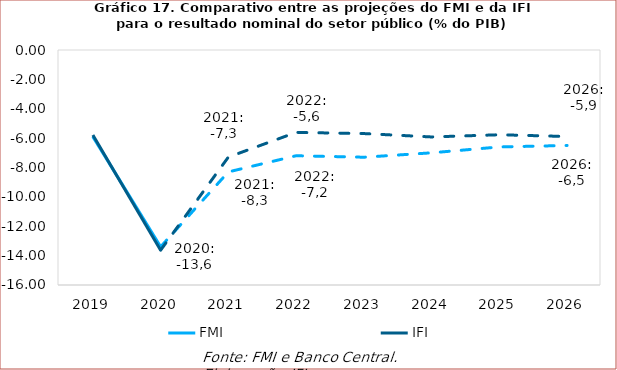
| Category | FMI | IFI |
|---|---|---|
| 2019.0 | -5.9 | -5.79 |
| 2020.0 | -13.4 | -13.63 |
| 2021.0 | -8.3 | -7.29 |
| 2022.0 | -7.2 | -5.61 |
| 2023.0 | -7.3 | -5.69 |
| 2024.0 | -7 | -5.92 |
| 2025.0 | -6.6 | -5.77 |
| 2026.0 | -6.5 | -5.89 |